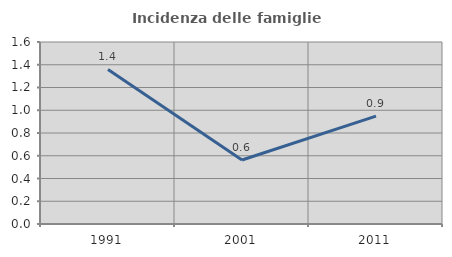
| Category | Incidenza delle famiglie numerose |
|---|---|
| 1991.0 | 1.358 |
| 2001.0 | 0.563 |
| 2011.0 | 0.949 |